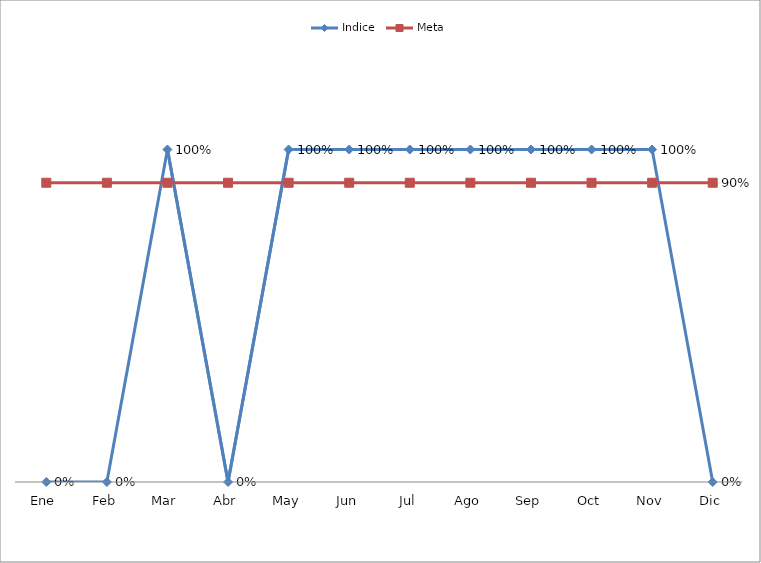
| Category | Indice | Meta |
|---|---|---|
| Ene | 0 | 0.9 |
| Feb | 0 | 0.9 |
| Mar | 1 | 0.9 |
| Abr | 0 | 0.9 |
| May | 1 | 0.9 |
| Jun | 1 | 0.9 |
| Jul | 1 | 0.9 |
| Ago | 1 | 0.9 |
| Sep | 1 | 0.9 |
| Oct | 1 | 0.9 |
| Nov | 1 | 0.9 |
| Dic | 0 | 0.9 |